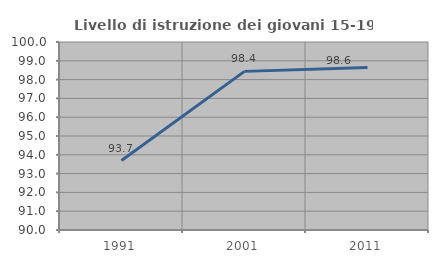
| Category | Livello di istruzione dei giovani 15-19 anni |
|---|---|
| 1991.0 | 93.694 |
| 2001.0 | 98.438 |
| 2011.0 | 98.639 |